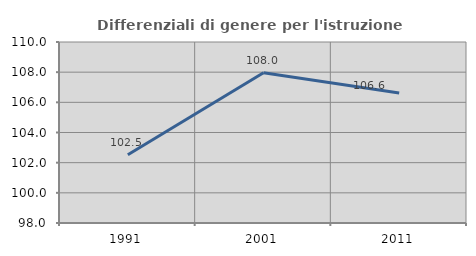
| Category | Differenziali di genere per l'istruzione superiore |
|---|---|
| 1991.0 | 102.523 |
| 2001.0 | 107.967 |
| 2011.0 | 106.622 |